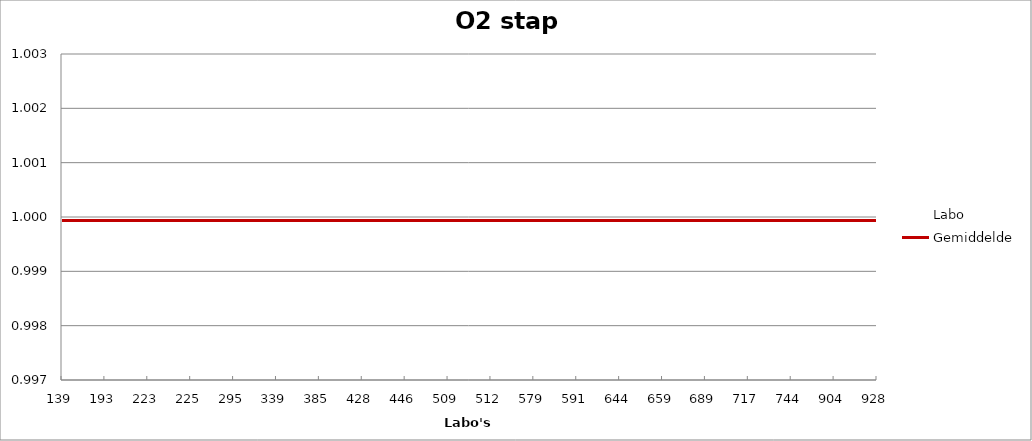
| Category | Labo | Gemiddelde |
|---|---|---|
| 139.0 | 1.001 | 1 |
| 193.0 | 1 | 1 |
| 223.0 | 1 | 1 |
| 225.0 | 1 | 1 |
| 295.0 | 1 | 1 |
| 339.0 | 1 | 1 |
| 385.0 | 0.999 | 1 |
| 428.0 | 1 | 1 |
| 446.0 | 1 | 1 |
| 509.0 | 1 | 1 |
| 512.0 | 1 | 1 |
| 579.0 | 1 | 1 |
| 591.0 | 1 | 1 |
| 644.0 | 1 | 1 |
| 659.0 | 1 | 1 |
| 689.0 | 1.001 | 1 |
| 717.0 | 0.999 | 1 |
| 744.0 | 1 | 1 |
| 904.0 | 1 | 1 |
| 928.0 | 0.997 | 1 |